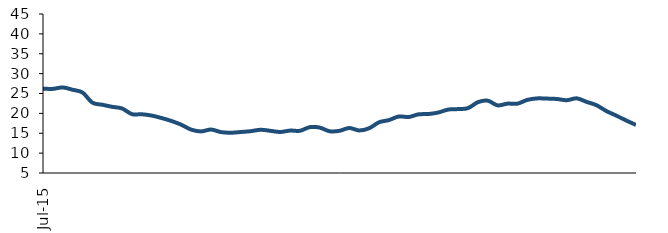
| Category | Series 0 |
|---|---|
| 2015-07-01 | 26.211 |
| 2015-08-01 | 26.164 |
| 2015-09-01 | 26.526 |
| 2015-10-01 | 25.934 |
| 2015-11-01 | 25.237 |
| 2015-12-01 | 22.698 |
| 2016-01-01 | 22.174 |
| 2016-02-01 | 21.651 |
| 2016-03-01 | 21.232 |
| 2016-04-01 | 19.808 |
| 2016-05-01 | 19.779 |
| 2016-06-01 | 19.446 |
| 2016-07-01 | 18.825 |
| 2016-08-01 | 18.085 |
| 2016-09-01 | 17.132 |
| 2016-10-01 | 15.903 |
| 2016-11-01 | 15.46 |
| 2016-12-01 | 15.937 |
| 2017-01-01 | 15.293 |
| 2017-02-01 | 15.126 |
| 2017-03-01 | 15.31 |
| 2017-04-01 | 15.511 |
| 2017-05-01 | 15.874 |
| 2017-06-01 | 15.611 |
| 2017-07-01 | 15.319 |
| 2017-08-01 | 15.669 |
| 2017-09-01 | 15.626 |
| 2017-10-01 | 16.532 |
| 2017-11-01 | 16.419 |
| 2017-12-01 | 15.5 |
| 2018-01-01 | 15.614 |
| 2018-02-01 | 16.321 |
| 2018-03-01 | 15.696 |
| 2018-04-01 | 16.261 |
| 2018-05-01 | 17.759 |
| 2018-06-01 | 18.314 |
| 2018-07-01 | 19.219 |
| 2018-08-01 | 19.086 |
| 2018-09-01 | 19.755 |
| 2018-10-01 | 19.838 |
| 2018-11-01 | 20.22 |
| 2018-12-01 | 20.96 |
| 2019-01-01 | 21.082 |
| 2019-02-01 | 21.313 |
| 2019-03-01 | 22.81 |
| 2019-04-01 | 23.194 |
| 2019-05-01 | 22.013 |
| 2019-06-01 | 22.451 |
| 2019-07-01 | 22.436 |
| 2019-08-01 | 23.387 |
| 2019-09-01 | 23.768 |
| 2019-10-01 | 23.718 |
| 2019-11-01 | 23.62 |
| 2019-12-01 | 23.31 |
| 2020-01-01 | 23.785 |
| 2020-02-01 | 22.896 |
| 2020-03-01 | 22.054 |
| 2020-04-01 | 20.588 |
| 2020-05-01 | 19.441 |
| 2020-06-01 | 18.223 |
| 2020-07-01 | 17.09 |